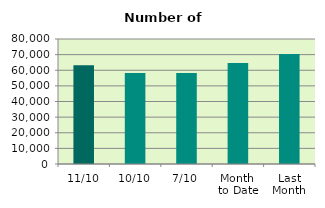
| Category | Series 0 |
|---|---|
| 11/10 | 63144 |
| 10/10 | 58238 |
| 7/10 | 58290 |
| Month 
to Date | 64684.857 |
| Last
Month | 70459.909 |